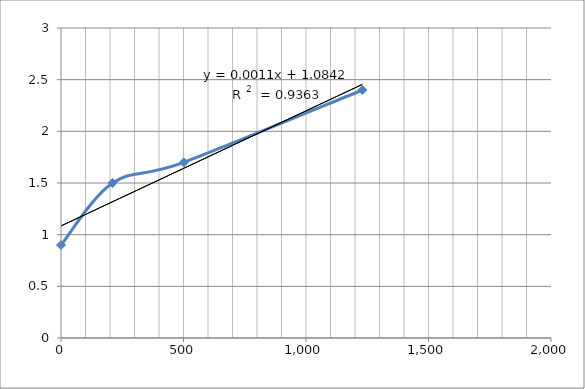
| Category | Series 0 |
|---|---|
| 0.0 | 0.9 |
| 210.37477902180316 | 1.5 |
| 501.6629345904537 | 1.7 |
| 1229.88332351208 | 2.4 |